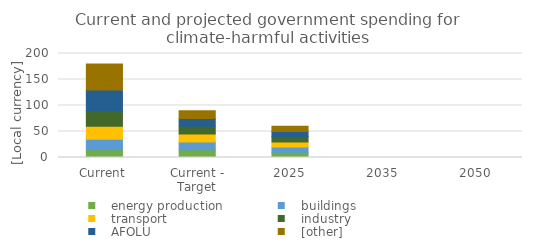
| Category |    energy production |    buildings |    transport |    industry |    AFOLU |    [other] |
|---|---|---|---|---|---|---|
| Current | 15 | 20 | 25 | 30 | 40 | 50 |
| Current - Target | 15 | 15 | 15 | 15 | 15 | 15 |
| 2025 | 10 | 10 | 10 | 10 | 10 | 10 |
| 2035 | 0 | 0 | 0 | 0 | 0 | 0 |
| 2050 | 0 | 0 | 0 | 0 | 0 | 0 |